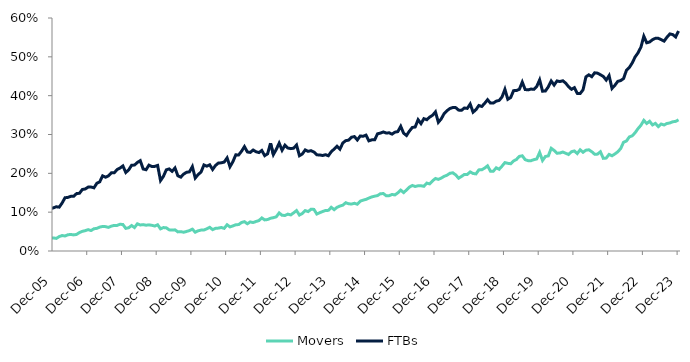
| Category | Movers | FTBs |
|---|---|---|
| 2005-05-01 | 0.029 | 0.071 |
| 2005-06-01 | 0.03 | 0.077 |
| 2005-07-01 | 0.029 | 0.083 |
| 2005-08-01 | 0.029 | 0.088 |
| 2005-09-01 | 0.031 | 0.094 |
| 2005-10-01 | 0.034 | 0.104 |
| 2005-11-01 | 0.033 | 0.109 |
| 2005-12-01 | 0.034 | 0.111 |
| 2006-01-01 | 0.032 | 0.114 |
| 2006-02-01 | 0.037 | 0.113 |
| 2006-03-01 | 0.04 | 0.124 |
| 2006-04-01 | 0.039 | 0.137 |
| 2006-05-01 | 0.042 | 0.138 |
| 2006-06-01 | 0.043 | 0.141 |
| 2006-07-01 | 0.041 | 0.141 |
| 2006-08-01 | 0.043 | 0.148 |
| 2006-09-01 | 0.048 | 0.149 |
| 2006-10-01 | 0.051 | 0.158 |
| 2006-11-01 | 0.052 | 0.16 |
| 2006-12-01 | 0.055 | 0.165 |
| 2007-01-01 | 0.053 | 0.165 |
| 2007-02-01 | 0.057 | 0.163 |
| 2007-03-01 | 0.058 | 0.174 |
| 2007-04-01 | 0.062 | 0.178 |
| 2007-05-01 | 0.063 | 0.194 |
| 2007-06-01 | 0.063 | 0.19 |
| 2007-07-01 | 0.061 | 0.193 |
| 2007-08-01 | 0.064 | 0.201 |
| 2007-09-01 | 0.066 | 0.201 |
| 2007-10-01 | 0.066 | 0.21 |
| 2007-11-01 | 0.069 | 0.214 |
| 2007-12-01 | 0.068 | 0.219 |
| 2008-01-01 | 0.058 | 0.202 |
| 2008-02-01 | 0.06 | 0.209 |
| 2008-03-01 | 0.066 | 0.221 |
| 2008-04-01 | 0.06 | 0.221 |
| 2008-05-01 | 0.07 | 0.228 |
| 2008-06-01 | 0.067 | 0.233 |
| 2008-07-01 | 0.068 | 0.211 |
| 2008-08-01 | 0.066 | 0.209 |
| 2008-09-01 | 0.067 | 0.221 |
| 2008-10-01 | 0.066 | 0.218 |
| 2008-11-01 | 0.064 | 0.218 |
| 2008-12-01 | 0.067 | 0.22 |
| 2009-01-01 | 0.057 | 0.181 |
| 2009-02-01 | 0.06 | 0.192 |
| 2009-03-01 | 0.06 | 0.209 |
| 2009-04-01 | 0.054 | 0.211 |
| 2009-05-01 | 0.054 | 0.205 |
| 2009-06-01 | 0.054 | 0.214 |
| 2009-07-01 | 0.049 | 0.194 |
| 2009-08-01 | 0.05 | 0.19 |
| 2009-09-01 | 0.048 | 0.198 |
| 2009-10-01 | 0.05 | 0.203 |
| 2009-11-01 | 0.053 | 0.204 |
| 2009-12-01 | 0.056 | 0.217 |
| 2010-01-01 | 0.048 | 0.188 |
| 2010-02-01 | 0.052 | 0.197 |
| 2010-03-01 | 0.054 | 0.203 |
| 2010-04-01 | 0.054 | 0.222 |
| 2010-05-01 | 0.057 | 0.218 |
| 2010-06-01 | 0.061 | 0.222 |
| 2010-07-01 | 0.055 | 0.21 |
| 2010-08-01 | 0.058 | 0.22 |
| 2010-09-01 | 0.059 | 0.227 |
| 2010-10-01 | 0.061 | 0.227 |
| 2010-11-01 | 0.058 | 0.229 |
| 2010-12-01 | 0.068 | 0.24 |
| 2011-01-01 | 0.062 | 0.217 |
| 2011-02-01 | 0.065 | 0.23 |
| 2011-03-01 | 0.068 | 0.248 |
| 2011-04-01 | 0.068 | 0.247 |
| 2011-05-01 | 0.074 | 0.257 |
| 2011-06-01 | 0.076 | 0.269 |
| 2011-07-01 | 0.07 | 0.255 |
| 2011-08-01 | 0.075 | 0.254 |
| 2011-09-01 | 0.073 | 0.26 |
| 2011-10-01 | 0.076 | 0.256 |
| 2011-11-01 | 0.078 | 0.253 |
| 2011-12-01 | 0.085 | 0.259 |
| 2012-01-01 | 0.08 | 0.245 |
| 2012-02-01 | 0.081 | 0.25 |
| 2012-03-01 | 0.084 | 0.277 |
| 2012-04-01 | 0.086 | 0.248 |
| 2012-05-01 | 0.088 | 0.262 |
| 2012-06-01 | 0.098 | 0.278 |
| 2012-07-01 | 0.092 | 0.259 |
| 2012-08-01 | 0.092 | 0.273 |
| 2012-09-01 | 0.095 | 0.265 |
| 2012-10-01 | 0.093 | 0.264 |
| 2012-11-01 | 0.098 | 0.265 |
| 2012-12-01 | 0.104 | 0.273 |
| 2013-01-01 | 0.093 | 0.245 |
| 2013-02-01 | 0.097 | 0.25 |
| 2013-03-01 | 0.104 | 0.26 |
| 2013-04-01 | 0.101 | 0.257 |
| 2013-05-01 | 0.108 | 0.258 |
| 2013-06-01 | 0.107 | 0.255 |
| 2013-07-01 | 0.095 | 0.248 |
| 2013-08-01 | 0.099 | 0.247 |
| 2013-09-01 | 0.102 | 0.246 |
| 2013-10-01 | 0.104 | 0.248 |
| 2013-11-01 | 0.105 | 0.245 |
| 2013-12-01 | 0.112 | 0.256 |
| 2014-01-01 | 0.106 | 0.263 |
| 2014-02-01 | 0.113 | 0.27 |
| 2014-03-01 | 0.116 | 0.262 |
| 2014-04-01 | 0.118 | 0.278 |
| 2014-05-01 | 0.124 | 0.284 |
| 2014-06-01 | 0.122 | 0.285 |
| 2014-07-01 | 0.121 | 0.293 |
| 2014-08-01 | 0.123 | 0.295 |
| 2014-09-01 | 0.12 | 0.286 |
| 2014-10-01 | 0.128 | 0.296 |
| 2014-11-01 | 0.131 | 0.295 |
| 2014-12-01 | 0.133 | 0.298 |
| 2015-01-01 | 0.136 | 0.284 |
| 2015-02-01 | 0.139 | 0.286 |
| 2015-03-01 | 0.141 | 0.287 |
| 2015-04-01 | 0.143 | 0.302 |
| 2015-05-01 | 0.148 | 0.304 |
| 2015-06-01 | 0.148 | 0.307 |
| 2015-07-01 | 0.142 | 0.304 |
| 2015-08-01 | 0.142 | 0.304 |
| 2015-09-01 | 0.146 | 0.301 |
| 2015-10-01 | 0.144 | 0.306 |
| 2015-11-01 | 0.15 | 0.307 |
| 2015-12-01 | 0.157 | 0.321 |
| 2016-01-01 | 0.15 | 0.303 |
| 2016-02-01 | 0.157 | 0.297 |
| 2016-03-01 | 0.165 | 0.309 |
| 2016-04-01 | 0.169 | 0.318 |
| 2016-05-01 | 0.166 | 0.319 |
| 2016-06-01 | 0.168 | 0.338 |
| 2016-07-01 | 0.168 | 0.328 |
| 2016-08-01 | 0.167 | 0.341 |
| 2016-09-01 | 0.175 | 0.338 |
| 2016-10-01 | 0.173 | 0.345 |
| 2016-11-01 | 0.181 | 0.349 |
| 2016-12-01 | 0.187 | 0.358 |
| 2017-01-01 | 0.184 | 0.331 |
| 2017-02-01 | 0.188 | 0.34 |
| 2017-03-01 | 0.192 | 0.354 |
| 2017-04-01 | 0.195 | 0.361 |
| 2017-05-01 | 0.2 | 0.367 |
| 2017-06-01 | 0.201 | 0.369 |
| 2017-07-01 | 0.196 | 0.369 |
| 2017-08-01 | 0.187 | 0.363 |
| 2017-09-01 | 0.192 | 0.362 |
| 2017-10-01 | 0.197 | 0.368 |
| 2017-11-01 | 0.197 | 0.367 |
| 2017-12-01 | 0.204 | 0.378 |
| 2018-01-01 | 0.2 | 0.357 |
| 2018-02-01 | 0.199 | 0.364 |
| 2018-03-01 | 0.209 | 0.375 |
| 2018-04-01 | 0.209 | 0.372 |
| 2018-05-01 | 0.214 | 0.38 |
| 2018-06-01 | 0.219 | 0.39 |
| 2018-07-01 | 0.206 | 0.381 |
| 2018-08-01 | 0.205 | 0.381 |
| 2018-09-01 | 0.214 | 0.386 |
| 2018-10-01 | 0.21 | 0.388 |
| 2018-11-01 | 0.219 | 0.397 |
| 2018-12-01 | 0.228 | 0.416 |
| 2019-01-01 | 0.226 | 0.391 |
| 2019-02-01 | 0.225 | 0.395 |
| 2019-03-01 | 0.232 | 0.413 |
| 2019-04-01 | 0.236 | 0.413 |
| 2019-05-01 | 0.244 | 0.417 |
| 2019-06-01 | 0.245 | 0.435 |
| 2019-07-01 | 0.235 | 0.416 |
| 2019-08-01 | 0.233 | 0.415 |
| 2019-09-01 | 0.233 | 0.417 |
| 2019-10-01 | 0.235 | 0.416 |
| 2019-11-01 | 0.237 | 0.424 |
| 2019-12-01 | 0.254 | 0.441 |
| 2020-01-01 | 0.233 | 0.411 |
| 2020-02-01 | 0.243 | 0.412 |
| 2020-03-01 | 0.245 | 0.423 |
| 2020-04-01 | 0.265 | 0.438 |
| 2020-05-01 | 0.259 | 0.427 |
| 2020-06-01 | 0.252 | 0.438 |
| 2020-07-01 | 0.252 | 0.436 |
| 2020-08-01 | 0.255 | 0.438 |
| 2020-09-01 | 0.252 | 0.432 |
| 2020-10-01 | 0.248 | 0.423 |
| 2020-11-01 | 0.256 | 0.416 |
| 2020-12-01 | 0.258 | 0.421 |
| 2021-01-01 | 0.251 | 0.406 |
| 2021-02-01 | 0.261 | 0.405 |
| 2021-03-01 | 0.254 | 0.415 |
| 2021-04-01 | 0.26 | 0.449 |
| 2021-05-01 | 0.261 | 0.454 |
| 2021-06-01 | 0.256 | 0.449 |
| 2021-07-01 | 0.249 | 0.459 |
| 2021-08-01 | 0.249 | 0.458 |
| 2021-09-01 | 0.256 | 0.454 |
| 2021-10-01 | 0.239 | 0.45 |
| 2021-11-01 | 0.239 | 0.44 |
| 2021-12-01 | 0.249 | 0.452 |
| 2022-01-01 | 0.245 | 0.419 |
| 2022-02-01 | 0.25 | 0.427 |
| 2022-03-01 | 0.256 | 0.437 |
| 2022-04-01 | 0.264 | 0.439 |
| 2022-05-01 | 0.28 | 0.444 |
| 2022-06-01 | 0.283 | 0.465 |
| 2022-07-01 | 0.294 | 0.473 |
| 2022-08-01 | 0.297 | 0.484 |
| 2022-09-01 | 0.305 | 0.5 |
| 2022-10-01 | 0.315 | 0.51 |
| 2022-11-01 | 0.324 | 0.525 |
| 2022-12-01 | 0.336 | 0.553 |
| 2023-01-01 | 0.328 | 0.536 |
| 2023-02-01 | 0.334 | 0.538 |
| 2023-03-01 | 0.325 | 0.544 |
| 2023-04-01 | 0.329 | 0.548 |
| 2023-05-01 | 0.32 | 0.548 |
| 2023-06-01 | 0.327 | 0.544 |
| 2023-07-01 | 0.324 | 0.54 |
| 2023-08-01 | 0.328 | 0.551 |
| 2023-09-01 | 0.33 | 0.559 |
| 2023-10-01 | 0.333 | 0.557 |
| 2023-11-01 | 0.334 | 0.551 |
| 2023-12-01 | 0.338 | 0.567 |